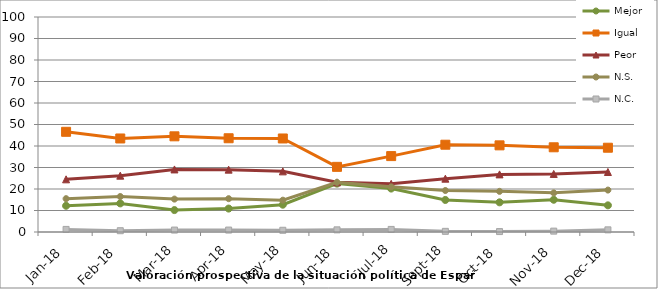
| Category | Mejor | Igual | Peor | N.S. | N.C. |
|---|---|---|---|---|---|
| 2018-01-01 | 12.2 | 46.6 | 24.5 | 15.5 | 1.2 |
| 2018-02-01 | 13.3 | 43.5 | 26.2 | 16.5 | 0.6 |
| 2018-03-01 | 10.2 | 44.5 | 29.1 | 15.3 | 0.9 |
| 2018-04-01 | 10.9 | 43.6 | 29 | 15.5 | 0.9 |
| 2018-05-01 | 12.7 | 43.5 | 28.2 | 14.8 | 0.8 |
| 2018-06-01 | 22.5 | 30.3 | 23.1 | 23.1 | 1 |
| 2018-07-01 | 20.2 | 35.3 | 22.4 | 21 | 1.2 |
| 2018-09-01 | 14.9 | 40.6 | 24.8 | 19.3 | 0.3 |
| 2018-10-01 | 13.8 | 40.3 | 26.8 | 18.9 | 0.2 |
| 2018-11-01 | 15 | 39.4 | 27 | 18.2 | 0.4 |
| 2018-12-01 | 12.4 | 39.2 | 27.9 | 19.5 | 1 |